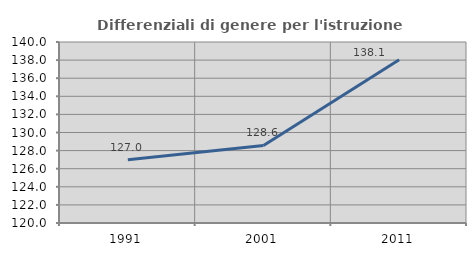
| Category | Differenziali di genere per l'istruzione superiore |
|---|---|
| 1991.0 | 126.997 |
| 2001.0 | 128.567 |
| 2011.0 | 138.05 |